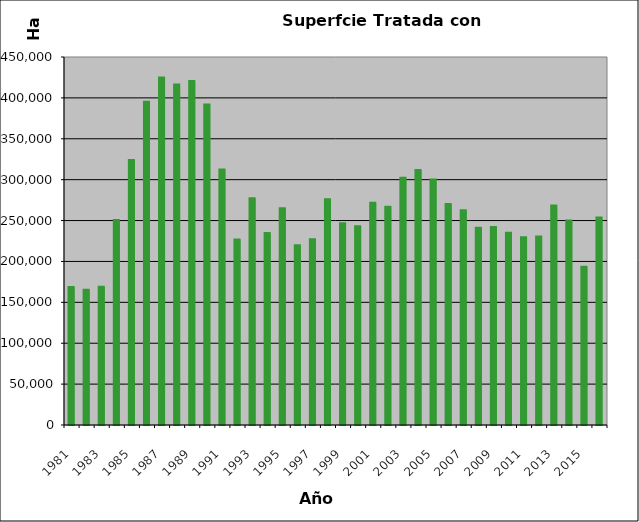
| Category | SUPERFICIE QUEMADA (ha) |
|---|---|
| 1981.0 | 168828 |
| 1982.0 | 165260 |
| 1983.0 | 169031 |
| 1984.0 | 250727 |
| 1985.0 | 324117 |
| 1986.0 | 395158 |
| 1987.0 | 424861 |
| 1988.0 | 416300 |
| 1989.0 | 420778 |
| 1990.0 | 392001 |
| 1991.0 | 312407 |
| 1992.0 | 226961.36 |
| 1993.0 | 277315.24 |
| 1994.0 | 234667.36 |
| 1995.0 | 265102.78 |
| 1996.0 | 219680.96 |
| 1997.0 | 227108.62 |
| 1998.0 | 276086.65 |
| 1999.0 | 246818.3 |
| 2000.0 | 243106.24 |
| 2001.0 | 271796.32 |
| 2002.0 | 266981.85 |
| 2003.0 | 302195.26 |
| 2004.0 | 311879.41 |
| 2005.0 | 300110.79 |
| 2006.0 | 270129.79 |
| 2007.0 | 262571.01 |
| 2008.0 | 241124 |
| 2009.0 | 242063.08 |
| 2010.0 | 235110 |
| 2011.0 | 229567 |
| 2012.0 | 230364 |
| 2013.0 | 268504 |
| 2014.0 | 250093 |
| 2015.0 | 193437.89 |
| 2016.0 | 253638 |